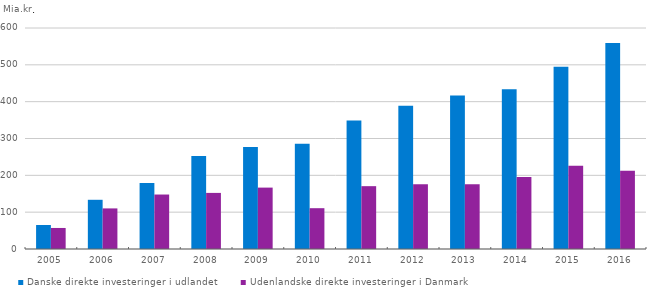
| Category | Danske direkte investeringer i udlandet | Udenlandske direkte investeringer i Danmark |
|---|---|---|
| 2005.0 | 65.1 | 57.1 |
| 2006.0 | 133.6 | 110.2 |
| 2007.0 | 179.5 | 147.9 |
| 2008.0 | 252.3 | 152.3 |
| 2009.0 | 277 | 166.7 |
| 2010.0 | 285.6 | 110.8 |
| 2011.0 | 349.2 | 170.6 |
| 2012.0 | 389.2 | 175.9 |
| 2013.0 | 417 | 175.6 |
| 2014.0 | 433.8 | 195.3 |
| 2015.0 | 494.8 | 225.9 |
| 2016.0 | 559.3 | 212.2 |